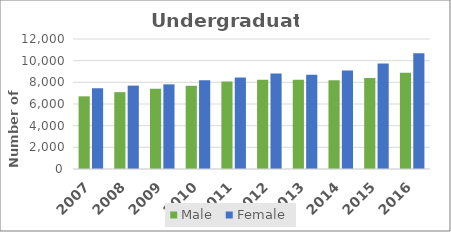
| Category | Male | Female |
|---|---|---|
| 2007 | 6708 | 7465 |
| 2008 | 7093 | 7696 |
| 2009 | 7404 | 7815 |
| 2010 | 7682 | 8187 |
| 2011 | 8069 | 8455 |
| 2012 | 8233 | 8818 |
| 2013 | 8236 | 8696 |
| 2014 | 8201 | 9092 |
| 2015 | 8409 | 9729 |
| 2016 | 8891 | 10691 |